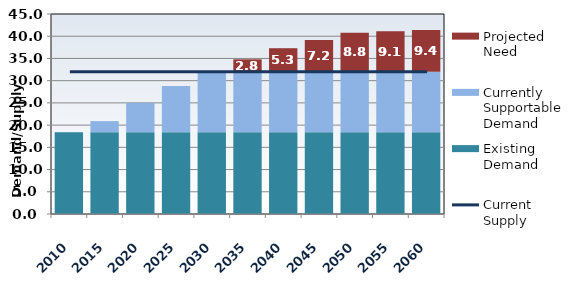
| Category | Existing Demand | Currently Supportable Demand | Projected Need |
|---|---|---|---|
| 2010.0 | 18.4 | 0 | 0 |
| 2015.0 | 18.4 | 2.5 | 0 |
| 2020.0 | 18.4 | 6.6 | 0 |
| 2025.0 | 18.4 | 10.4 | 0 |
| 2030.0 | 18.4 | 13.5 | 0 |
| 2035.0 | 18.4 | 13.6 | 2.8 |
| 2040.0 | 18.4 | 13.6 | 5.3 |
| 2045.0 | 18.4 | 13.6 | 7.15 |
| 2050.0 | 18.4 | 13.6 | 8.8 |
| 2055.0 | 18.4 | 13.6 | 9.1 |
| 2060.0 | 18.4 | 13.6 | 9.4 |